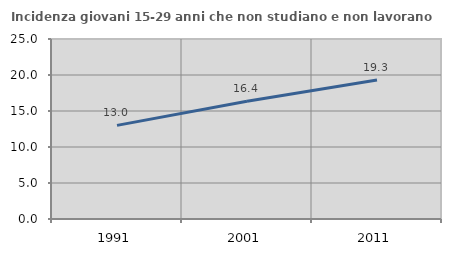
| Category | Incidenza giovani 15-29 anni che non studiano e non lavorano  |
|---|---|
| 1991.0 | 13.006 |
| 2001.0 | 16.364 |
| 2011.0 | 19.298 |